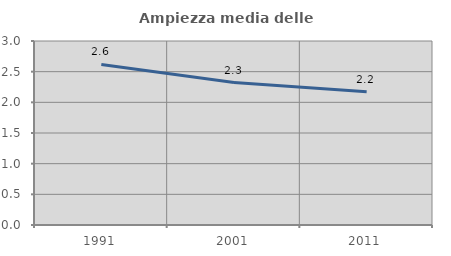
| Category | Ampiezza media delle famiglie |
|---|---|
| 1991.0 | 2.618 |
| 2001.0 | 2.323 |
| 2011.0 | 2.171 |